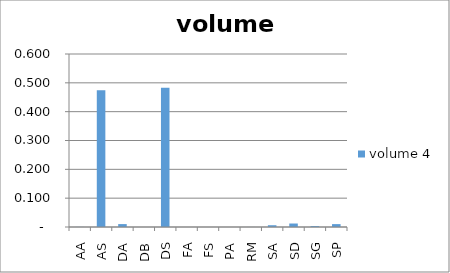
| Category |  volume 4  |
|---|---|
| AA | 0 |
| AS | 0.474 |
| DA | 0.01 |
| DB | 0 |
| DS | 0.483 |
| FA | 0 |
| FS | 0 |
| PA | 0 |
| RM | 0 |
| SA | 0.006 |
| SD | 0.012 |
| SG | 0.003 |
| SP | 0.01 |